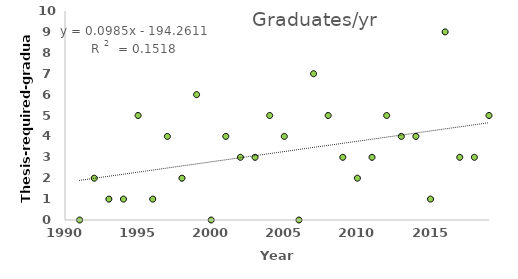
| Category | Thesis Required Graduates |
|---|---|
| 1991.0 | 0 |
| 1992.0 | 2 |
| 1993.0 | 1 |
| 1994.0 | 1 |
| 1995.0 | 5 |
| 1996.0 | 1 |
| 1997.0 | 4 |
| 1998.0 | 2 |
| 1999.0 | 6 |
| 2000.0 | 0 |
| 2001.0 | 4 |
| 2002.0 | 3 |
| 2003.0 | 3 |
| 2004.0 | 5 |
| 2005.0 | 4 |
| 2006.0 | 0 |
| 2007.0 | 7 |
| 2008.0 | 5 |
| 2009.0 | 3 |
| 2010.0 | 2 |
| 2011.0 | 3 |
| 2012.0 | 5 |
| 2013.0 | 4 |
| 2014.0 | 4 |
| 2015.0 | 1 |
| 2016.0 | 9 |
| 2017.0 | 3 |
| 2018.0 | 3 |
| 2019.0 | 5 |